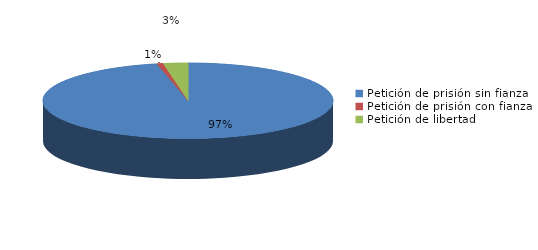
| Category | Series 0 |
|---|---|
| Petición de prisión sin fianza | 140 |
| Petición de prisión con fianza | 1 |
| Petición de libertad | 4 |